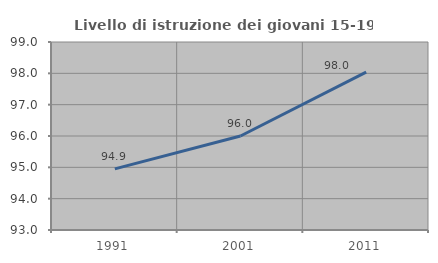
| Category | Livello di istruzione dei giovani 15-19 anni |
|---|---|
| 1991.0 | 94.949 |
| 2001.0 | 96 |
| 2011.0 | 98.039 |